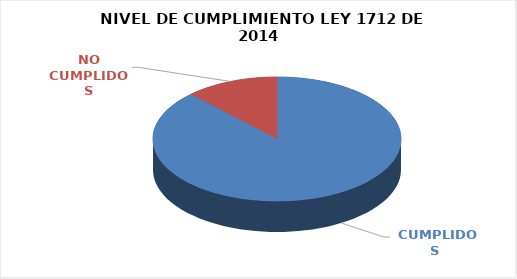
| Category | Series 0 |
|---|---|
|  CUMPLIDOS | 101 |
| NO CUMPLIDOS | 14 |